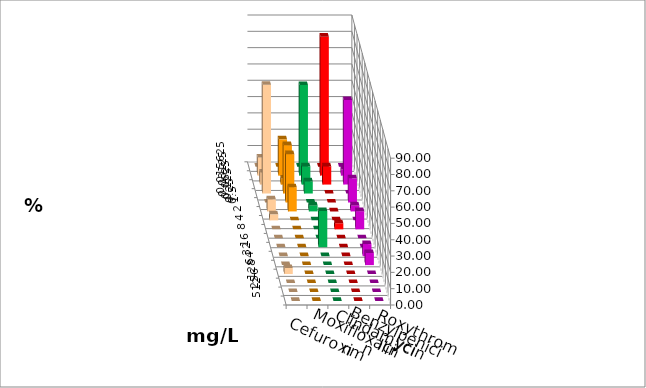
| Category | Cefuroxim | Moxifloxacin | Clindamycin | Benzylpenicillin | Roxythromycin |
|---|---|---|---|---|---|
| 0.015625 | 0 | 0 | 0 | 0 | 0 |
| 0.03125 | 11.111 | 22.222 | 55.556 | 85.185 | 3.704 |
| 0.0625 | 7.407 | 3.704 | 11.111 | 11.111 | 51.852 |
| 0.125 | 66.667 | 29.63 | 7.407 | 0 | 0 |
| 0.25 | 0 | 29.63 | 0 | 0 | 14.815 |
| 0.5 | 7.407 | 14.815 | 3.704 | 0 | 3.704 |
| 1.0 | 3.704 | 0 | 0 | 0 | 0 |
| 2.0 | 0 | 0 | 0 | 3.704 | 11.111 |
| 4.0 | 0 | 0 | 0 | 0 | 0 |
| 8.0 | 0 | 0 | 22.222 | 0 | 0 |
| 16.0 | 0 | 0 | 0 | 0 | 7.407 |
| 32.0 | 0 | 0 | 0 | 0 | 7.407 |
| 64.0 | 3.704 | 0 | 0 | 0 | 0 |
| 128.0 | 0 | 0 | 0 | 0 | 0 |
| 256.0 | 0 | 0 | 0 | 0 | 0 |
| 512.0 | 0 | 0 | 0 | 0 | 0 |